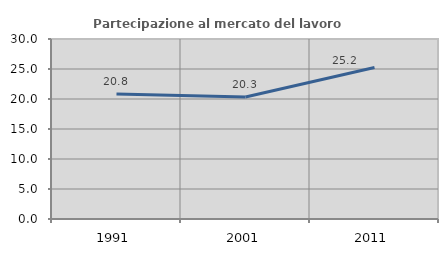
| Category | Partecipazione al mercato del lavoro  femminile |
|---|---|
| 1991.0 | 20.818 |
| 2001.0 | 20.333 |
| 2011.0 | 25.245 |